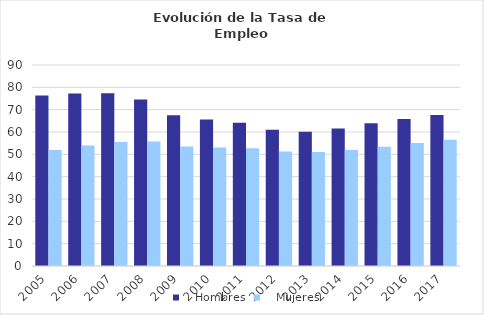
| Category |    Hombres |    Mujeres |
|---|---|---|
| 2005.0 | 76.38 | 51.92 |
| 2006.0 | 77.27 | 53.97 |
| 2007.0 | 77.38 | 55.5 |
| 2008.0 | 74.6 | 55.74 |
| 2009.0 | 67.55 | 53.54 |
| 2010.0 | 65.62 | 53.02 |
| 2011.0 | 64.1 | 52.76 |
| 2012.0 | 61.04 | 51.26 |
| 2013.0 | 60.08 | 51 |
| 2014.0 | 61.57 | 51.95 |
| 2015.0 | 63.964 | 53.442 |
| 2016.0 | 65.823 | 55.118 |
| 2017.0 | 67.584 | 56.525 |